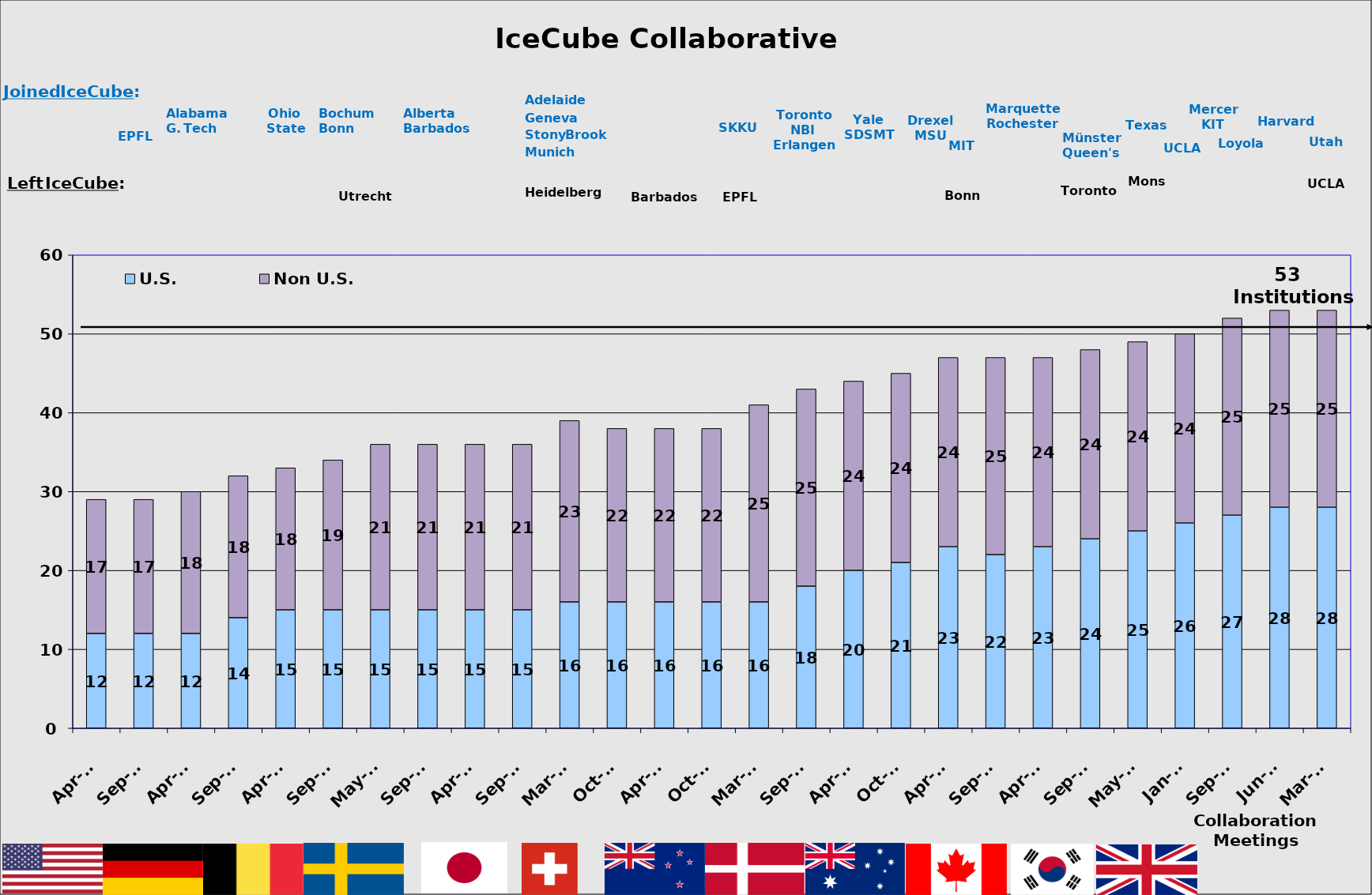
| Category | U.S. | Non U.S. |
|---|---|---|
| Apr-07 | 12 | 17 |
| Sep-07 | 12 | 17 |
| Apr-08 | 12 | 18 |
| Sep-08 | 14 | 18 |
| Apr-09 | 15 | 18 |
| Sep-09 | 15 | 19 |
| May-10 | 15 | 21 |
| Sep-10 | 15 | 21 |
| Apr-11 | 15 | 21 |
| Sep-11 | 15 | 21 |
| Mar-12 | 16 | 23 |
| Oct-12 | 16 | 22 |
| Apr-13 | 16 | 22 |
| Oct-13 | 16 | 22 |
| Mar-14 | 16 | 25 |
| Sep-14 | 18 | 25 |
| Apr-15 | 20 | 24 |
| Oct-15 | 21 | 24 |
| Apr-16 | 23 | 24 |
| Sep-16 | 22 | 25 |
| Apr-17 | 23 | 24 |
| Sep-17 | 24 | 24 |
| May-18 | 25 | 24 |
| Jan-19 | 26 | 24 |
| Sep-19 | 27 | 25 |
| Jun-20 | 28 | 25 |
| Mar-21 | 28 | 25 |